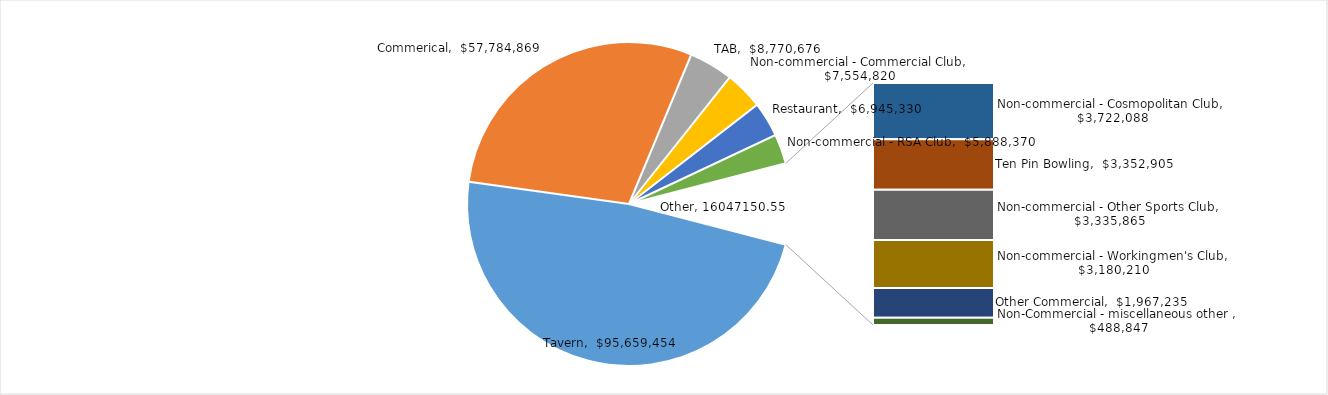
| Category | Total GMP |
|---|---|
| Tavern | 95659454.5 |
| Commerical | 57784868.83 |
| TAB | 8770676.28 |
| Non-commercial - Commercial Club | 7554819.86 |
| Restaurant | 6945329.63 |
| Non-commercial - RSA Club | 5888370.11 |
| Non-commercial - Cosmopolitan Club | 3722088.28 |
| Ten Pin Bowling | 3352904.97 |
| Non-commercial - Other Sports Club | 3335864.84 |
| Non-commercial - Workingmen's Club | 3180210 |
| Other Commercial | 1967235.15 |
| Non-Commercial - miscellaneous other  | 488847.31 |